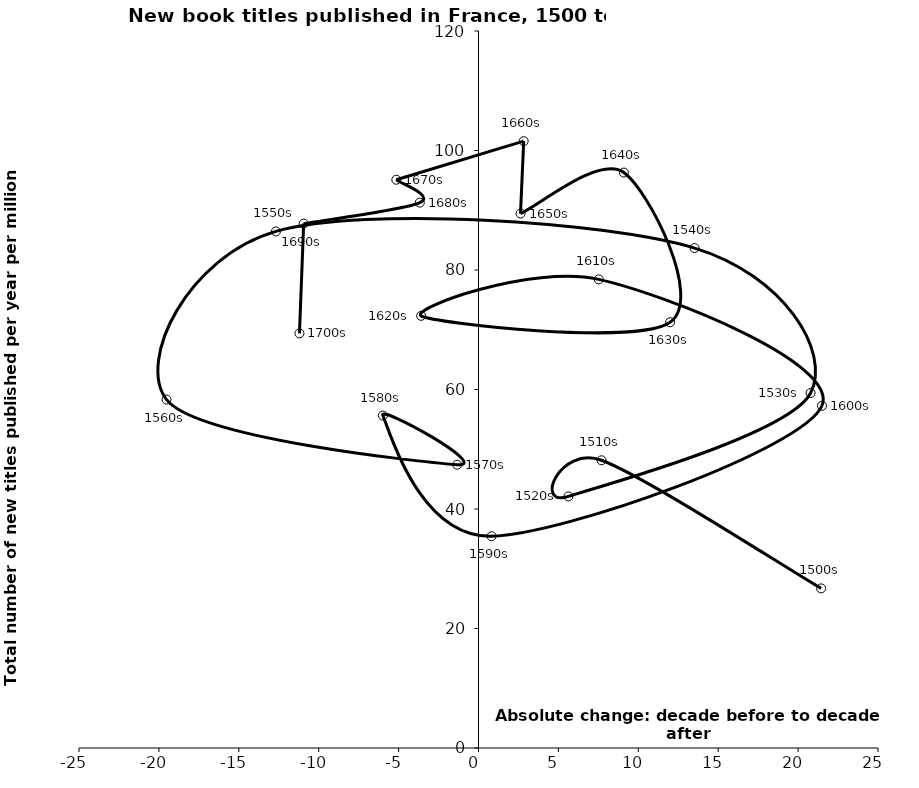
| Category | Series 0 |
|---|---|
| 21.44164846356498 | 26.712 |
| 7.697238179343518 | 48.154 |
| 5.628720599068899 | 42.107 |
| 20.781115479351158 | 59.411 |
| 13.521956589626406 | 83.669 |
| -12.67709271578152 | 86.455 |
| -19.521521780967614 | 58.315 |
| -1.3353899681107357 | 47.412 |
| -5.984393999747564 | 55.644 |
| 0.8162469712601705 | 35.444 |
| 21.49398696730907 | 57.277 |
| 7.524937421383978 | 78.432 |
| -3.5877282374326853 | 72.326 |
| 11.990073652796006 | 71.256 |
| 9.09782024193182 | 96.307 |
| 2.6288107498328515 | 89.452 |
| 2.82847598134677 | 101.564 |
| -5.143280192542882 | 95.109 |
| -3.6729214606690164 | 91.278 |
| -10.941807612586281 | 87.763 |
| -11.2032912643215 | 69.394 |